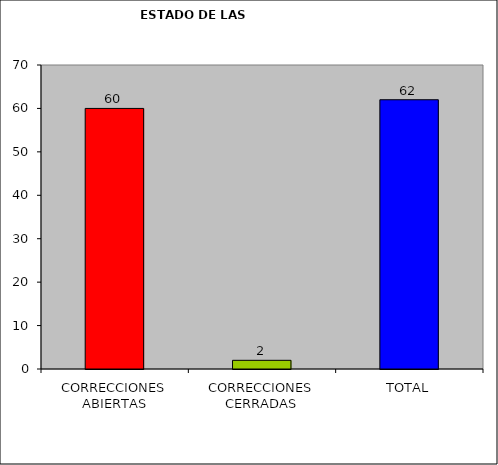
| Category | Series 0 |
|---|---|
| CORRECCIONES ABIERTAS | 60 |
| CORRECCIONES CERRADAS | 2 |
| TOTAL | 62 |